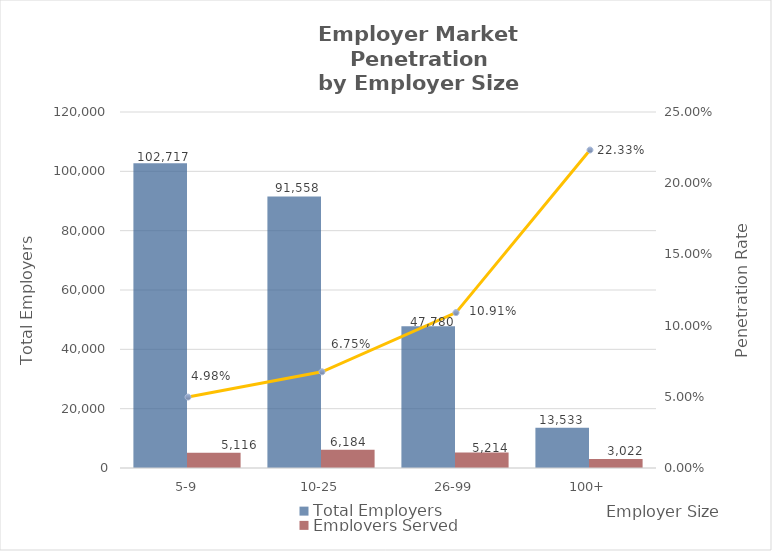
| Category | Total Employers | Employers Served |
|---|---|---|
| 5-9 | 102717 | 5116 |
| 10-25 | 91558 | 6184 |
| 26-99 | 47780 | 5214 |
| 100+ | 13533 | 3022 |